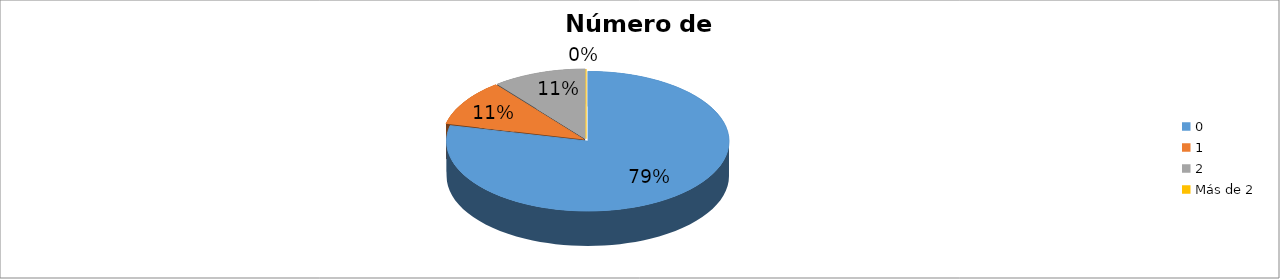
| Category | Series 0 |
|---|---|
| 0 | 0.786 |
| 1 | 0.107 |
| 2 | 0.107 |
| Más de 2 | 0 |